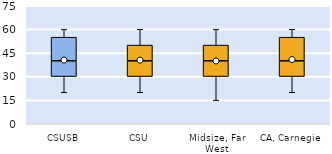
| Category | 25th | 50th | 75th |
|---|---|---|---|
| CSUSB | 30 | 10 | 15 |
| CSU | 30 | 10 | 10 |
| Midsize, Far West | 30 | 10 | 10 |
| CA, Carnegie | 30 | 10 | 15 |